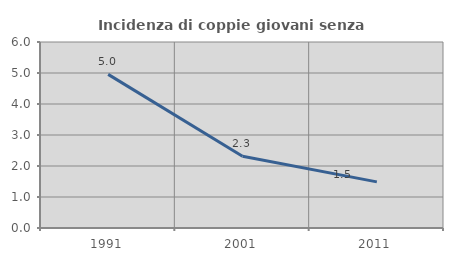
| Category | Incidenza di coppie giovani senza figli |
|---|---|
| 1991.0 | 4.955 |
| 2001.0 | 2.314 |
| 2011.0 | 1.488 |